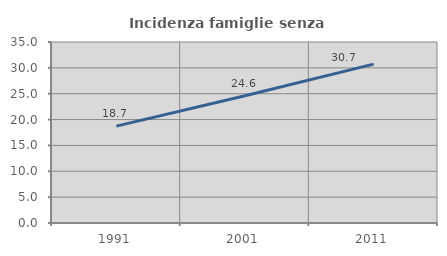
| Category | Incidenza famiglie senza nuclei |
|---|---|
| 1991.0 | 18.733 |
| 2001.0 | 24.596 |
| 2011.0 | 30.724 |